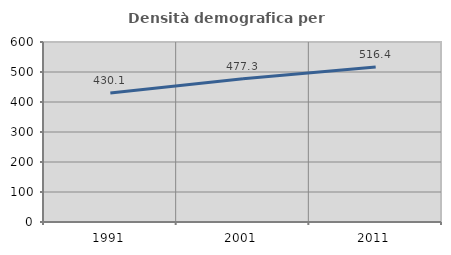
| Category | Densità demografica |
|---|---|
| 1991.0 | 430.144 |
| 2001.0 | 477.261 |
| 2011.0 | 516.359 |